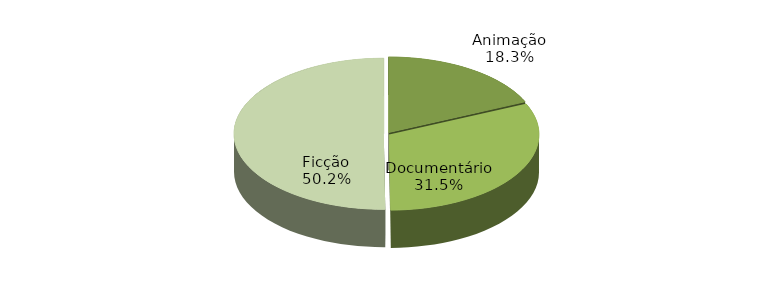
| Category | Series 0 |
|---|---|
| Animação | 20295 |
| Documentário | 34940 |
| Ficção | 55595 |